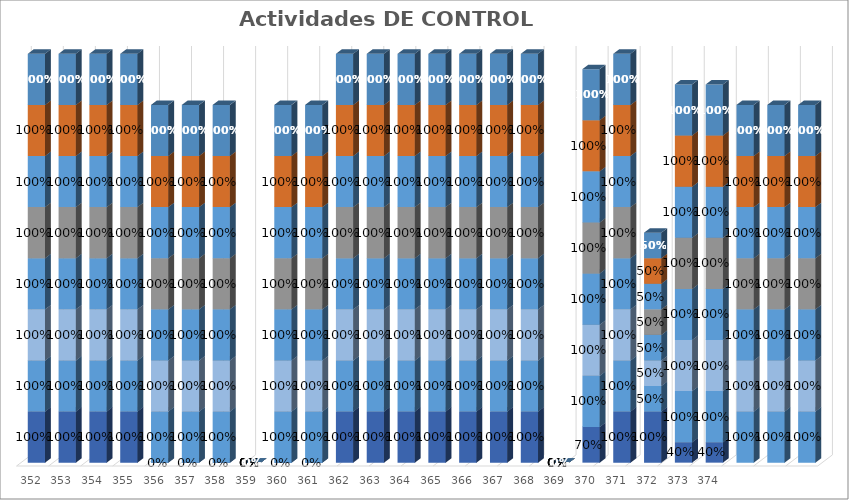
| Category | % Avance |
|---|---|
| 352.0 | 1 |
| 353.0 | 1 |
| 354.0 | 1 |
| 355.0 | 1 |
| 356.0 | 1 |
| 357.0 | 1 |
| 358.0 | 1 |
| 359.0 | 0 |
| 360.0 | 1 |
| 361.0 | 1 |
| 362.0 | 1 |
| 363.0 | 1 |
| 364.0 | 1 |
| 365.0 | 1 |
| 366.0 | 1 |
| 367.0 | 1 |
| 368.0 | 1 |
| 369.0 | 0 |
| 370.0 | 1 |
| 371.0 | 1 |
| 372.0 | 0.5 |
| 373.0 | 1 |
| 374.0 | 1 |